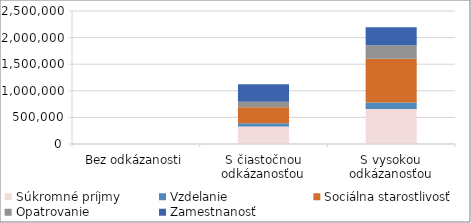
| Category | Súkromné príjmy | Vzdelanie | Sociálna starostlivosť  | Opatrovanie  | Zamestnanosť |
|---|---|---|---|---|---|
| Bez odkázanosti | 0 | 0 | 0 | 0 | 0 |
| S čiastočnou odkázanosťou | 328081.68 | 63000.012 | 301902.832 | 98855.496 | 331836.522 |
| S vysokou odkázanosťou | 659892.72 | 120074.287 | 824706.049 | 253265.076 | 335991.36 |